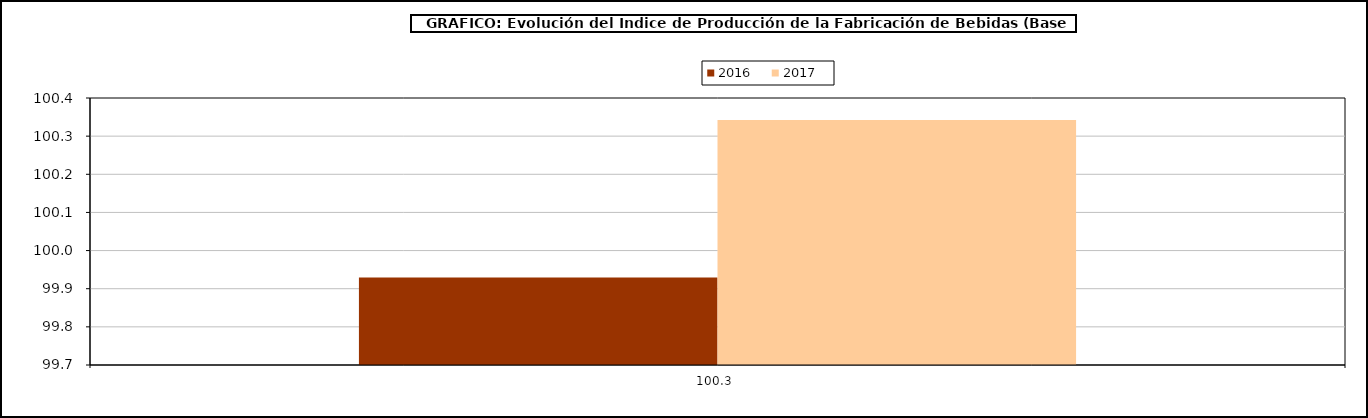
| Category | 2016 | 2017 |
|---|---|---|
| 100.34258333333332 | 99.929 | 100.343 |